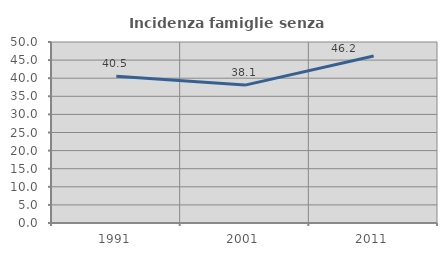
| Category | Incidenza famiglie senza nuclei |
|---|---|
| 1991.0 | 40.541 |
| 2001.0 | 38.095 |
| 2011.0 | 46.154 |